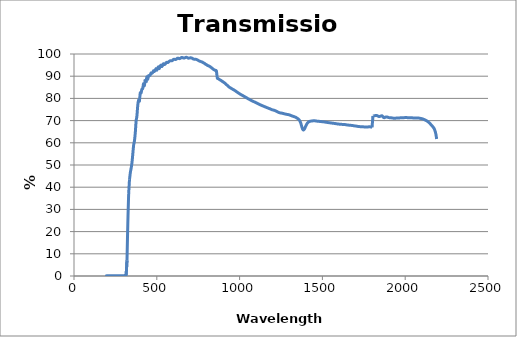
| Category | % Transmission |
|---|---|
| 190.0 | -0.119 |
| 195.0 | -0.063 |
| 200.0 | -0.028 |
| 205.0 | -0.015 |
| 210.0 | -0.012 |
| 215.0 | -0.008 |
| 220.0 | -0.004 |
| 225.0 | -0.003 |
| 230.0 | -0.006 |
| 235.0 | -0.005 |
| 240.0 | -0.001 |
| 245.0 | 0.002 |
| 250.0 | -0.001 |
| 255.0 | -0.002 |
| 260.0 | -0.003 |
| 265.0 | 0.003 |
| 270.0 | 0.002 |
| 275.0 | 0.003 |
| 280.0 | 0.002 |
| 285.0 | 0.003 |
| 290.0 | 0.006 |
| 295.0 | 0.01 |
| 300.0 | 0.034 |
| 305.0 | 0.078 |
| 310.0 | 0.078 |
| 315.0 | 0.581 |
| 320.0 | 7.02 |
| 325.0 | 23.679 |
| 330.0 | 36.967 |
| 335.0 | 43.324 |
| 340.0 | 46.45 |
| 345.0 | 48.542 |
| 350.0 | 50.96 |
| 355.0 | 54.918 |
| 360.0 | 58.86 |
| 365.0 | 60.85 |
| 370.0 | 64.405 |
| 375.0 | 69.675 |
| 380.0 | 72.205 |
| 385.0 | 76.842 |
| 390.0 | 79.243 |
| 395.0 | 78.786 |
| 400.0 | 82.441 |
| 405.0 | 82.434 |
| 410.0 | 84.171 |
| 415.0 | 84.427 |
| 420.0 | 86.626 |
| 425.0 | 85.76 |
| 430.0 | 88.559 |
| 435.0 | 87.078 |
| 440.0 | 89.718 |
| 445.0 | 88.571 |
| 450.0 | 90.196 |
| 455.0 | 90.203 |
| 460.0 | 90.457 |
| 465.0 | 91.442 |
| 470.0 | 91.262 |
| 475.0 | 91.66 |
| 480.0 | 92.428 |
| 485.0 | 92.085 |
| 490.0 | 92.581 |
| 495.0 | 93.414 |
| 500.0 | 92.673 |
| 505.0 | 93.638 |
| 510.0 | 94.229 |
| 515.0 | 93.392 |
| 520.0 | 94.392 |
| 525.0 | 95.012 |
| 530.0 | 94.317 |
| 535.0 | 94.858 |
| 540.0 | 95.645 |
| 545.0 | 95.331 |
| 550.0 | 95.371 |
| 555.0 | 95.98 |
| 560.0 | 96.251 |
| 565.0 | 96.132 |
| 570.0 | 96.309 |
| 575.0 | 96.677 |
| 580.0 | 96.932 |
| 585.0 | 96.979 |
| 590.0 | 96.936 |
| 595.0 | 97.135 |
| 600.0 | 97.52 |
| 605.0 | 97.614 |
| 610.0 | 97.548 |
| 615.0 | 97.558 |
| 620.0 | 97.805 |
| 625.0 | 98.108 |
| 630.0 | 98.091 |
| 635.0 | 97.914 |
| 640.0 | 97.962 |
| 645.0 | 98.229 |
| 650.0 | 98.456 |
| 655.0 | 98.391 |
| 660.0 | 98.222 |
| 665.0 | 98.142 |
| 670.0 | 98.3 |
| 675.0 | 98.466 |
| 680.0 | 98.488 |
| 685.0 | 98.324 |
| 690.0 | 98.141 |
| 695.0 | 98.156 |
| 700.0 | 98.225 |
| 705.0 | 98.283 |
| 710.0 | 98.192 |
| 715.0 | 98.015 |
| 720.0 | 97.787 |
| 725.0 | 97.665 |
| 730.0 | 97.61 |
| 735.0 | 97.627 |
| 740.0 | 97.514 |
| 745.0 | 97.341 |
| 750.0 | 97.133 |
| 755.0 | 96.897 |
| 760.0 | 96.716 |
| 765.0 | 96.639 |
| 770.0 | 96.448 |
| 775.0 | 96.353 |
| 780.0 | 96.09 |
| 785.0 | 95.899 |
| 790.0 | 95.659 |
| 795.0 | 95.373 |
| 800.0 | 95.183 |
| 805.0 | 94.901 |
| 810.0 | 94.738 |
| 815.0 | 94.556 |
| 820.0 | 94.379 |
| 825.0 | 94.111 |
| 830.0 | 93.818 |
| 835.0 | 93.517 |
| 840.0 | 93.223 |
| 845.0 | 92.936 |
| 850.0 | 92.762 |
| 855.0 | 92.526 |
| 860.0 | 92.304 |
| 865.0 | 89.296 |
| 870.0 | 88.953 |
| 875.0 | 88.665 |
| 880.0 | 88.425 |
| 885.0 | 88.193 |
| 890.0 | 87.956 |
| 895.0 | 87.695 |
| 900.0 | 87.453 |
| 905.0 | 87.18 |
| 910.0 | 86.919 |
| 915.0 | 86.609 |
| 920.0 | 86.237 |
| 925.0 | 85.918 |
| 930.0 | 85.575 |
| 935.0 | 85.227 |
| 940.0 | 84.948 |
| 945.0 | 84.721 |
| 950.0 | 84.494 |
| 955.0 | 84.272 |
| 960.0 | 84.054 |
| 965.0 | 83.849 |
| 970.0 | 83.618 |
| 975.0 | 83.362 |
| 980.0 | 83.091 |
| 985.0 | 82.827 |
| 990.0 | 82.579 |
| 995.0 | 82.326 |
| 1000.0 | 82.087 |
| 1005.0 | 81.863 |
| 1010.0 | 81.633 |
| 1015.0 | 81.443 |
| 1020.0 | 81.237 |
| 1025.0 | 81.013 |
| 1030.0 | 80.81 |
| 1035.0 | 80.59 |
| 1040.0 | 80.371 |
| 1045.0 | 80.132 |
| 1050.0 | 79.903 |
| 1055.0 | 79.72 |
| 1060.0 | 79.517 |
| 1065.0 | 79.301 |
| 1070.0 | 79.103 |
| 1075.0 | 78.919 |
| 1080.0 | 78.728 |
| 1085.0 | 78.554 |
| 1090.0 | 78.392 |
| 1095.0 | 78.21 |
| 1100.0 | 78.038 |
| 1105.0 | 77.847 |
| 1110.0 | 77.647 |
| 1115.0 | 77.461 |
| 1120.0 | 77.268 |
| 1125.0 | 77.102 |
| 1130.0 | 76.951 |
| 1135.0 | 76.785 |
| 1140.0 | 76.624 |
| 1145.0 | 76.469 |
| 1150.0 | 76.311 |
| 1155.0 | 76.15 |
| 1160.0 | 76.005 |
| 1165.0 | 75.85 |
| 1170.0 | 75.697 |
| 1175.0 | 75.551 |
| 1180.0 | 75.405 |
| 1185.0 | 75.251 |
| 1190.0 | 75.084 |
| 1195.0 | 74.933 |
| 1200.0 | 74.815 |
| 1205.0 | 74.714 |
| 1210.0 | 74.61 |
| 1215.0 | 74.462 |
| 1220.0 | 74.288 |
| 1225.0 | 74.099 |
| 1230.0 | 73.891 |
| 1235.0 | 73.709 |
| 1240.0 | 73.574 |
| 1245.0 | 73.476 |
| 1250.0 | 73.4 |
| 1255.0 | 73.347 |
| 1260.0 | 73.261 |
| 1265.0 | 73.166 |
| 1270.0 | 73.065 |
| 1275.0 | 72.961 |
| 1280.0 | 72.878 |
| 1285.0 | 72.803 |
| 1290.0 | 72.736 |
| 1295.0 | 72.678 |
| 1300.0 | 72.565 |
| 1305.0 | 72.446 |
| 1310.0 | 72.303 |
| 1315.0 | 72.143 |
| 1320.0 | 72 |
| 1325.0 | 71.875 |
| 1330.0 | 71.743 |
| 1335.0 | 71.605 |
| 1340.0 | 71.431 |
| 1345.0 | 71.204 |
| 1350.0 | 70.951 |
| 1355.0 | 70.645 |
| 1360.0 | 70.276 |
| 1365.0 | 69.668 |
| 1370.0 | 68.672 |
| 1375.0 | 67.397 |
| 1380.0 | 66.254 |
| 1385.0 | 65.754 |
| 1390.0 | 66.011 |
| 1395.0 | 66.763 |
| 1400.0 | 67.595 |
| 1405.0 | 68.337 |
| 1410.0 | 68.916 |
| 1415.0 | 69.298 |
| 1420.0 | 69.539 |
| 1425.0 | 69.678 |
| 1430.0 | 69.747 |
| 1435.0 | 69.828 |
| 1440.0 | 69.865 |
| 1445.0 | 69.91 |
| 1450.0 | 69.923 |
| 1455.0 | 69.907 |
| 1460.0 | 69.847 |
| 1465.0 | 69.784 |
| 1470.0 | 69.732 |
| 1475.0 | 69.701 |
| 1480.0 | 69.662 |
| 1485.0 | 69.629 |
| 1490.0 | 69.585 |
| 1495.0 | 69.542 |
| 1500.0 | 69.503 |
| 1505.0 | 69.451 |
| 1510.0 | 69.412 |
| 1515.0 | 69.351 |
| 1520.0 | 69.293 |
| 1525.0 | 69.213 |
| 1530.0 | 69.174 |
| 1535.0 | 69.104 |
| 1540.0 | 69.066 |
| 1545.0 | 69.024 |
| 1550.0 | 68.941 |
| 1555.0 | 68.911 |
| 1560.0 | 68.839 |
| 1565.0 | 68.783 |
| 1570.0 | 68.749 |
| 1575.0 | 68.691 |
| 1580.0 | 68.625 |
| 1585.0 | 68.569 |
| 1590.0 | 68.512 |
| 1595.0 | 68.476 |
| 1600.0 | 68.425 |
| 1605.0 | 68.367 |
| 1610.0 | 68.321 |
| 1615.0 | 68.312 |
| 1620.0 | 68.294 |
| 1625.0 | 68.268 |
| 1630.0 | 68.259 |
| 1635.0 | 68.241 |
| 1640.0 | 68.176 |
| 1645.0 | 68.084 |
| 1650.0 | 68.056 |
| 1655.0 | 68.018 |
| 1660.0 | 67.946 |
| 1665.0 | 67.917 |
| 1670.0 | 67.895 |
| 1675.0 | 67.839 |
| 1680.0 | 67.803 |
| 1685.0 | 67.743 |
| 1690.0 | 67.661 |
| 1695.0 | 67.612 |
| 1700.0 | 67.534 |
| 1705.0 | 67.519 |
| 1710.0 | 67.445 |
| 1715.0 | 67.373 |
| 1720.0 | 67.323 |
| 1725.0 | 67.291 |
| 1730.0 | 67.236 |
| 1735.0 | 67.222 |
| 1740.0 | 67.234 |
| 1745.0 | 67.19 |
| 1750.0 | 67.171 |
| 1755.0 | 67.089 |
| 1760.0 | 67.104 |
| 1765.0 | 67.123 |
| 1770.0 | 67.135 |
| 1775.0 | 67.148 |
| 1780.0 | 67.187 |
| 1785.0 | 67.214 |
| 1790.0 | 67.173 |
| 1795.0 | 67.05 |
| 1800.0 | 66.94 |
| 1805.0 | 72.087 |
| 1810.0 | 72.158 |
| 1815.0 | 72.199 |
| 1820.0 | 72.26 |
| 1825.0 | 72.313 |
| 1830.0 | 72.254 |
| 1835.0 | 72.042 |
| 1840.0 | 71.882 |
| 1845.0 | 71.875 |
| 1850.0 | 71.958 |
| 1855.0 | 72.107 |
| 1860.0 | 72.162 |
| 1865.0 | 71.815 |
| 1870.0 | 71.36 |
| 1875.0 | 71.336 |
| 1880.0 | 71.53 |
| 1885.0 | 71.621 |
| 1890.0 | 71.635 |
| 1895.0 | 71.527 |
| 1900.0 | 71.364 |
| 1905.0 | 71.327 |
| 1910.0 | 71.325 |
| 1915.0 | 71.278 |
| 1920.0 | 71.203 |
| 1925.0 | 71.142 |
| 1930.0 | 71.086 |
| 1935.0 | 71.047 |
| 1940.0 | 71.069 |
| 1945.0 | 71.134 |
| 1950.0 | 71.18 |
| 1955.0 | 71.194 |
| 1960.0 | 71.206 |
| 1965.0 | 71.212 |
| 1970.0 | 71.242 |
| 1975.0 | 71.266 |
| 1980.0 | 71.273 |
| 1985.0 | 71.3 |
| 1990.0 | 71.337 |
| 1995.0 | 71.339 |
| 2000.0 | 71.344 |
| 2005.0 | 71.359 |
| 2010.0 | 71.344 |
| 2015.0 | 71.333 |
| 2020.0 | 71.335 |
| 2025.0 | 71.32 |
| 2030.0 | 71.28 |
| 2035.0 | 71.239 |
| 2040.0 | 71.23 |
| 2045.0 | 71.227 |
| 2050.0 | 71.203 |
| 2055.0 | 71.16 |
| 2060.0 | 71.131 |
| 2065.0 | 71.127 |
| 2070.0 | 71.131 |
| 2075.0 | 71.139 |
| 2080.0 | 71.142 |
| 2085.0 | 71.111 |
| 2090.0 | 71.027 |
| 2095.0 | 70.946 |
| 2100.0 | 70.863 |
| 2105.0 | 70.755 |
| 2110.0 | 70.624 |
| 2115.0 | 70.476 |
| 2120.0 | 70.296 |
| 2125.0 | 70.086 |
| 2130.0 | 69.882 |
| 2135.0 | 69.635 |
| 2140.0 | 69.348 |
| 2145.0 | 69.016 |
| 2150.0 | 68.644 |
| 2155.0 | 68.237 |
| 2160.0 | 67.807 |
| 2165.0 | 67.393 |
| 2170.0 | 66.929 |
| 2175.0 | 66.334 |
| 2180.0 | 65.419 |
| 2185.0 | 63.957 |
| 2190.0 | 61.701 |